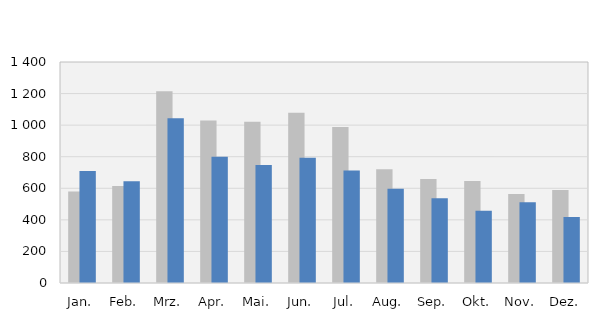
| Category | 2021 | 2022 |
|---|---|---|
| Jan. | 579 | 710 |
| Feb. | 614 | 644 |
| Mrz. | 1214 | 1043 |
| Apr. | 1030 | 800 |
| Mai. | 1022 | 747 |
| Jun. | 1079 | 794 |
| Jul. | 989 | 713 |
| Aug. | 721 | 597 |
| Sep. | 659 | 537 |
| Okt. | 646 | 457 |
| Nov. | 564 | 512 |
| Dez. | 589 | 418 |